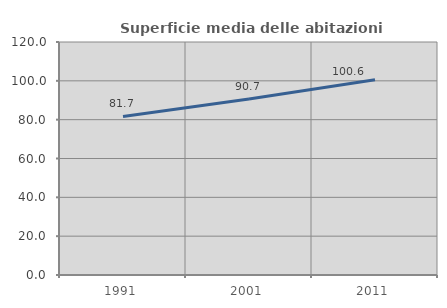
| Category | Superficie media delle abitazioni occupate |
|---|---|
| 1991.0 | 81.68 |
| 2001.0 | 90.689 |
| 2011.0 | 100.59 |